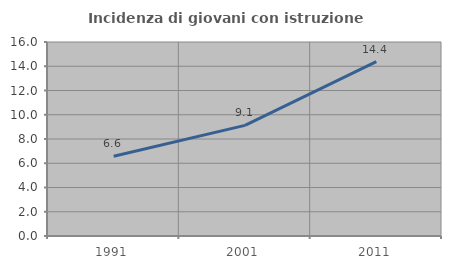
| Category | Incidenza di giovani con istruzione universitaria |
|---|---|
| 1991.0 | 6.573 |
| 2001.0 | 9.124 |
| 2011.0 | 14.379 |